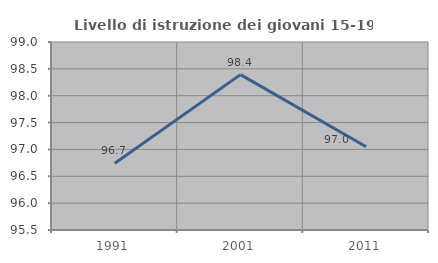
| Category | Livello di istruzione dei giovani 15-19 anni |
|---|---|
| 1991.0 | 96.742 |
| 2001.0 | 98.392 |
| 2011.0 | 97.049 |